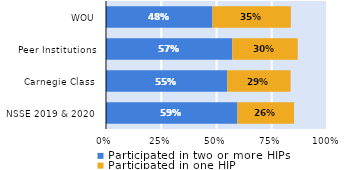
| Category | Participated in two or more HIPs | Participated in one HIP |
|---|---|---|
| NSSE 2019 & 2020 | 0.595 | 0.256 |
| Carnegie Class | 0.549 | 0.287 |
| Peer Institutions | 0.571 | 0.296 |
| WOU | 0.482 | 0.355 |